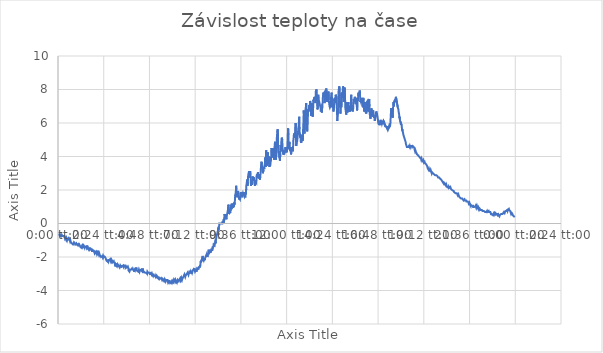
| Category | Závislost teploty na čase |
|---|---|
| 0.0006481481481481481 | -0.625 |
| 0.001365740740740741 | -0.625 |
| 0.0020717592592592593 | -0.625 |
| 0.002789351851851852 | -0.688 |
| 0.0034953703703703705 | -0.688 |
| 0.004212962962962963 | -0.688 |
| 0.004930555555555555 | -0.688 |
| 0.005636574074074074 | -0.75 |
| 0.006354166666666667 | -0.688 |
| 0.007071759259259259 | -0.75 |
| 0.007777777777777777 | -0.75 |
| 0.00849537037037037 | -0.688 |
| 0.00920138888888889 | -0.688 |
| 0.009918981481481482 | -0.75 |
| 0.010636574074074074 | -0.75 |
| 0.011342592592592592 | -0.75 |
| 0.012060185185185186 | -0.75 |
| 0.012777777777777777 | -0.75 |
| 0.013483796296296298 | -0.75 |
| 0.014201388888888888 | -0.812 |
| 0.014907407407407406 | -0.875 |
| 0.015625 | -0.812 |
| 0.016342592592592593 | -0.812 |
| 0.01704861111111111 | -0.875 |
| 0.017766203703703704 | -0.938 |
| 0.018483796296296297 | -0.875 |
| 0.019189814814814816 | -0.875 |
| 0.01990740740740741 | -1 |
| 0.020613425925925927 | -0.938 |
| 0.021331018518518517 | -0.938 |
| 0.022048611111111113 | -0.938 |
| 0.022754629629629628 | -0.875 |
| 0.023472222222222217 | -1 |
| 0.02417824074074074 | -0.938 |
| 0.024895833333333336 | -0.938 |
| 0.025613425925925925 | -1 |
| 0.02631944444444444 | -1.062 |
| 0.027037037037037037 | -1 |
| 0.02774305555555556 | -1.062 |
| 0.02804398148148148 | -1.125 |
| 0.02847222222222222 | -1.125 |
| 0.02918981481481481 | -1.125 |
| 0.02990740740740741 | -1.125 |
| 0.03061342592592593 | -1.188 |
| 0.031331018518518515 | -1.188 |
| 0.03203703703703704 | -1.188 |
| 0.03275462962962963 | -1.25 |
| 0.03347222222222222 | -1.25 |
| 0.03417824074074074 | -1.188 |
| 0.034895833333333334 | -1.125 |
| 0.03561342592592592 | -1.125 |
| 0.03631944444444444 | -1.125 |
| 0.03703703703703704 | -1.188 |
| 0.03774305555555556 | -1.25 |
| 0.03846064814814815 | -1.25 |
| 0.03917824074074074 | -1.25 |
| 0.03988425925925926 | -1.188 |
| 0.040601851851851854 | -1.25 |
| 0.04131944444444444 | -1.25 |
| 0.042025462962962966 | -1.25 |
| 0.042743055555555555 | -1.25 |
| 0.04344907407407408 | -1.312 |
| 0.04416666666666667 | -1.25 |
| 0.04488425925925926 | -1.188 |
| 0.04559027777777778 | -1.312 |
| 0.046307870370370374 | -1.25 |
| 0.04702546296296297 | -1.25 |
| 0.047731481481481486 | -1.312 |
| 0.04844907407407408 | -1.375 |
| 0.0491550925925926 | -1.375 |
| 0.04987268518518518 | -1.375 |
| 0.050590277777777776 | -1.438 |
| 0.05129629629629629 | -1.375 |
| 0.05201388888888889 | -1.375 |
| 0.05273148148148148 | -1.312 |
| 0.0534375 | -1.375 |
| 0.054155092592592595 | -1.312 |
| 0.054872685185185184 | -1.312 |
| 0.05557870370370371 | -1.375 |
| 0.056296296296296296 | -1.312 |
| 0.05700231481481482 | -1.312 |
| 0.05771990740740741 | -1.375 |
| 0.058437499999999996 | -1.438 |
| 0.05914351851851852 | -1.375 |
| 0.05986111111111111 | -1.375 |
| 0.0605787037037037 | -1.375 |
| 0.06128472222222222 | -1.375 |
| 0.06200231481481481 | -1.375 |
| 0.06270833333333332 | -1.438 |
| 0.06342592592592593 | -1.375 |
| 0.06414351851851852 | -1.312 |
| 0.06484953703703704 | -1.5 |
| 0.06556712962962963 | -1.5 |
| 0.06628472222222222 | -1.5 |
| 0.06699074074074074 | -1.562 |
| 0.06770833333333333 | -1.5 |
| 0.06842592592592593 | -1.438 |
| 0.06913194444444444 | -1.562 |
| 0.06984953703703704 | -1.562 |
| 0.07055555555555555 | -1.562 |
| 0.07127314814814815 | -1.5 |
| 0.07199074074074074 | -1.5 |
| 0.07269675925925927 | -1.562 |
| 0.07341435185185186 | -1.5 |
| 0.07413194444444444 | -1.625 |
| 0.07457175925925925 | -1.688 |
| 0.07486111111111111 | -1.688 |
| 0.07556712962962964 | -1.562 |
| 0.07628472222222223 | -1.625 |
| 0.07699074074074073 | -1.625 |
| 0.07770833333333334 | -1.625 |
| 0.07842592592592591 | -1.625 |
| 0.07913194444444445 | -1.688 |
| 0.07984953703703704 | -1.75 |
| 0.08056712962962963 | -1.688 |
| 0.08127314814814814 | -1.688 |
| 0.08199074074074074 | -1.75 |
| 0.08270833333333333 | -1.75 |
| 0.08341435185185185 | -1.688 |
| 0.08413194444444444 | -1.75 |
| 0.08484953703703703 | -1.812 |
| 0.08555555555555555 | -1.75 |
| 0.08627314814814814 | -1.75 |
| 0.08697916666666666 | -1.812 |
| 0.08769675925925925 | -1.625 |
| 0.08841435185185186 | -1.75 |
| 0.08912037037037036 | -1.812 |
| 0.08983796296296297 | -1.875 |
| 0.09055555555555556 | -1.812 |
| 0.09126157407407408 | -1.875 |
| 0.09197916666666667 | -1.875 |
| 0.09269675925925926 | -1.938 |
| 0.09340277777777778 | -1.938 |
| 0.09412037037037037 | -2 |
| 0.09483796296296297 | -2 |
| 0.09554398148148148 | -2 |
| 0.09626157407407408 | -2 |
| 0.09696759259259259 | -1.938 |
| 0.0976851851851852 | -2 |
| 0.09840277777777778 | -1.938 |
| 0.0991087962962963 | -2 |
| 0.0998263888888889 | -1.938 |
| 0.10053240740740742 | -1.938 |
| 0.10125 | -1.938 |
| 0.10196759259259258 | -1.938 |
| 0.10267361111111112 | -2 |
| 0.1033912037037037 | -2 |
| 0.10410879629629628 | -2.062 |
| 0.1048148148148148 | -2.125 |
| 0.1055324074074074 | -2.125 |
| 0.10625 | -2.125 |
| 0.10682870370370372 | -2.25 |
| 0.10697916666666667 | -2.188 |
| 0.10768518518518518 | -2.25 |
| 0.10840277777777778 | -2.25 |
| 0.10910879629629629 | -2.25 |
| 0.10982638888888889 | -2.312 |
| 0.11054398148148148 | -2.125 |
| 0.11125 | -2.25 |
| 0.11196759259259259 | -2.188 |
| 0.11268518518518518 | -2.188 |
| 0.1133912037037037 | -2.188 |
| 0.11410879629629629 | -2.125 |
| 0.1148263888888889 | -2.188 |
| 0.1155324074074074 | -2.25 |
| 0.11625 | -2.188 |
| 0.11695601851851851 | -2.25 |
| 0.11767361111111112 | -2.188 |
| 0.1183912037037037 | -2.188 |
| 0.11909722222222223 | -2.25 |
| 0.11981481481481482 | -2.312 |
| 0.12053240740740741 | -2.312 |
| 0.12123842592592593 | -2.312 |
| 0.12195601851851852 | -2.25 |
| 0.12267361111111112 | -2.312 |
| 0.12337962962962963 | -2.312 |
| 0.12409722222222223 | -2.375 |
| 0.12481481481481482 | -2.5 |
| 0.12552083333333333 | -2.562 |
| 0.12623842592592593 | -2.438 |
| 0.1269560185185185 | -2.438 |
| 0.12766203703703705 | -2.5 |
| 0.12837962962962962 | -2.375 |
| 0.12909722222222222 | -2.438 |
| 0.12980324074074073 | -2.5 |
| 0.13052083333333334 | -2.438 |
| 0.1312384259259259 | -2.438 |
| 0.13194444444444445 | -2.5 |
| 0.13266203703703702 | -2.5 |
| 0.13337962962962963 | -2.562 |
| 0.13408564814814813 | -2.562 |
| 0.13480324074074074 | -2.625 |
| 0.13550925925925925 | -2.562 |
| 0.13622685185185185 | -2.5 |
| 0.13694444444444445 | -2.5 |
| 0.13765046296296296 | -2.562 |
| 0.13836805555555556 | -2.625 |
| 0.13908564814814814 | -2.5 |
| 0.13979166666666668 | -2.562 |
| 0.14050925925925925 | -2.562 |
| 0.14122685185185185 | -2.562 |
| 0.14193287037037036 | -2.562 |
| 0.14265046296296297 | -2.5 |
| 0.14336805555555557 | -2.562 |
| 0.14407407407407408 | -2.5 |
| 0.14479166666666668 | -2.5 |
| 0.14550925925925925 | -2.5 |
| 0.1462152777777778 | -2.5 |
| 0.14693287037037037 | -2.5 |
| 0.14765046296296297 | -2.625 |
| 0.14835648148148148 | -2.625 |
| 0.14907407407407405 | -2.562 |
| 0.1497800925925926 | -2.562 |
| 0.1504976851851852 | -2.625 |
| 0.15121527777777777 | -2.625 |
| 0.15192129629629628 | -2.625 |
| 0.15263888888888888 | -2.562 |
| 0.15335648148148148 | -2.625 |
| 0.1540625 | -2.688 |
| 0.15439814814814815 | -2.812 |
| 0.15479166666666666 | -2.812 |
| 0.15550925925925926 | -2.812 |
| 0.15622685185185184 | -2.875 |
| 0.15693287037037038 | -2.812 |
| 0.15765046296296295 | -2.75 |
| 0.1583564814814815 | -2.75 |
| 0.15907407407407406 | -2.75 |
| 0.15979166666666667 | -2.75 |
| 0.16050925925925927 | -2.75 |
| 0.16121527777777778 | -2.75 |
| 0.16193287037037038 | -2.688 |
| 0.1626388888888889 | -2.75 |
| 0.1633564814814815 | -2.75 |
| 0.16407407407407407 | -2.75 |
| 0.1647800925925926 | -2.75 |
| 0.16549768518518518 | -2.75 |
| 0.16621527777777778 | -2.875 |
| 0.1669212962962963 | -2.75 |
| 0.1676388888888889 | -2.75 |
| 0.1683564814814815 | -2.812 |
| 0.1690625 | -2.75 |
| 0.1697800925925926 | -2.75 |
| 0.17049768518518518 | -2.688 |
| 0.17120370370370372 | -2.625 |
| 0.1719212962962963 | -2.75 |
| 0.17262731481481483 | -2.812 |
| 0.1733449074074074 | -2.812 |
| 0.1740625 | -2.812 |
| 0.17476851851851852 | -2.812 |
| 0.17548611111111112 | -2.875 |
| 0.17620370370370372 | -2.875 |
| 0.17690972222222223 | -2.75 |
| 0.17762731481481484 | -2.812 |
| 0.1783449074074074 | -2.875 |
| 0.17905092592592595 | -2.812 |
| 0.17976851851851852 | -2.812 |
| 0.18048611111111112 | -2.812 |
| 0.18119212962962963 | -2.812 |
| 0.18190972222222224 | -2.75 |
| 0.18262731481481484 | -2.812 |
| 0.18333333333333335 | -2.812 |
| 0.18405092592592595 | -2.812 |
| 0.18476851851851853 | -2.875 |
| 0.18547453703703706 | -2.688 |
| 0.18619212962962964 | -2.812 |
| 0.1869097222222222 | -2.938 |
| 0.18761574074074075 | -2.875 |
| 0.18833333333333332 | -2.875 |
| 0.18905092592592596 | -2.875 |
| 0.18975694444444446 | -2.875 |
| 0.190474537037037 | -2.938 |
| 0.19118055555555555 | -2.938 |
| 0.19189814814814818 | -2.938 |
| 0.19261574074074073 | -2.938 |
| 0.19332175925925923 | -2.938 |
| 0.19403935185185184 | -2.938 |
| 0.19475694444444444 | -3 |
| 0.19546296296296295 | -2.875 |
| 0.19618055555555555 | -2.875 |
| 0.19689814814814813 | -2.938 |
| 0.19760416666666666 | -2.938 |
| 0.19832175925925924 | -2.938 |
| 0.19903935185185184 | -2.938 |
| 0.19974537037037035 | -2.938 |
| 0.20046296296296295 | -2.938 |
| 0.20118055555555556 | -3.062 |
| 0.20188657407407407 | -2.938 |
| 0.20260416666666667 | -3.062 |
| 0.20332175925925924 | -3 |
| 0.20402777777777778 | -3 |
| 0.20474537037037036 | -3.062 |
| 0.20546296296296296 | -3 |
| 0.20616898148148147 | -3.062 |
| 0.20688657407407407 | -3.062 |
| 0.20759259259259258 | -3.125 |
| 0.20831018518518518 | -3 |
| 0.20902777777777778 | -3.125 |
| 0.2097337962962963 | -3.125 |
| 0.2104513888888889 | -3.125 |
| 0.21116898148148147 | -3.125 |
| 0.211875 | -3.125 |
| 0.21259259259259258 | -3.125 |
| 0.21331018518518519 | -3.188 |
| 0.2140162037037037 | -3.125 |
| 0.2147337962962963 | -3.188 |
| 0.2154513888888889 | -3.188 |
| 0.2161574074074074 | -3.125 |
| 0.216875 | -3.125 |
| 0.2175925925925926 | -3.188 |
| 0.21829861111111112 | -3.25 |
| 0.2190162037037037 | -3.25 |
| 0.2197337962962963 | -3.25 |
| 0.2204398148148148 | -3.312 |
| 0.2211574074074074 | -3.25 |
| 0.22187500000000002 | -3.25 |
| 0.22258101851851853 | -3.312 |
| 0.22329861111111113 | -3.312 |
| 0.22400462962962964 | -3.312 |
| 0.22472222222222224 | -3.312 |
| 0.22543981481481482 | -3.25 |
| 0.22614583333333335 | -3.25 |
| 0.22686342592592593 | -3.312 |
| 0.22758101851851853 | -3.312 |
| 0.2277662037037037 | -3.375 |
| 0.2283101851851852 | -3.375 |
| 0.2290162037037037 | -3.312 |
| 0.2297337962962963 | -3.312 |
| 0.23043981481481482 | -3.375 |
| 0.23115740740740742 | -3.375 |
| 0.23187499999999997 | -3.438 |
| 0.2325810185185185 | -3.375 |
| 0.23329861111111114 | -3.312 |
| 0.23401620370370368 | -3.312 |
| 0.2347222222222222 | -3.375 |
| 0.23543981481481482 | -3.438 |
| 0.2361574074074074 | -3.375 |
| 0.2368634259259259 | -3.375 |
| 0.23758101851851854 | -3.375 |
| 0.23829861111111109 | -3.375 |
| 0.23900462962962962 | -3.375 |
| 0.23972222222222225 | -3.438 |
| 0.2404398148148148 | -3.5 |
| 0.2411458333333333 | -3.438 |
| 0.2418634259259259 | -3.438 |
| 0.24258101851851852 | -3.5 |
| 0.24328703703703702 | -3.375 |
| 0.24400462962962963 | -3.5 |
| 0.2447222222222222 | -3.5 |
| 0.24542824074074074 | -3.5 |
| 0.2461458333333333 | -3.5 |
| 0.24686342592592592 | -3.562 |
| 0.24756944444444443 | -3.562 |
| 0.24828703703703703 | -3.562 |
| 0.24899305555555554 | -3.438 |
| 0.24971064814814814 | -3.5 |
| 0.2504282407407407 | -3.438 |
| 0.25113425925925925 | -3.438 |
| 0.2518518518518518 | -3.5 |
| 0.25256944444444446 | -3.438 |
| 0.25327546296296294 | -3.375 |
| 0.25399305555555557 | -3.438 |
| 0.25471064814814814 | -3.375 |
| 0.2554166666666667 | -3.375 |
| 0.25613425925925926 | -3.438 |
| 0.25685185185185183 | -3.375 |
| 0.25755787037037037 | -3.438 |
| 0.25827546296296294 | -3.5 |
| 0.2589930555555556 | -3.5 |
| 0.25969907407407405 | -3.438 |
| 0.2604166666666667 | -3.5 |
| 0.26112268518518517 | -3.438 |
| 0.2618402777777778 | -3.375 |
| 0.26255787037037037 | -3.375 |
| 0.2632638888888889 | -3.438 |
| 0.2639814814814815 | -3.438 |
| 0.26469907407407406 | -3.438 |
| 0.2654050925925926 | -3.438 |
| 0.26612268518518517 | -3.312 |
| 0.2668402777777778 | -3.375 |
| 0.2675462962962963 | -3.312 |
| 0.2682638888888889 | -3.375 |
| 0.2689814814814815 | -3.375 |
| 0.2696875 | -3.25 |
| 0.2704050925925926 | -3.312 |
| 0.2711226851851852 | -3.375 |
| 0.2718287037037037 | -3.312 |
| 0.2725462962962963 | -3.312 |
| 0.2732638888888889 | -3.312 |
| 0.2739699074074074 | -3.188 |
| 0.27468750000000003 | -3.188 |
| 0.2754050925925926 | -3.188 |
| 0.27611111111111114 | -3.062 |
| 0.2768287037037037 | -3.188 |
| 0.27753472222222225 | -3.125 |
| 0.2782523148148148 | -3.188 |
| 0.2789699074074074 | -3.125 |
| 0.27967592592592594 | -3.125 |
| 0.2803935185185185 | -3.062 |
| 0.2811111111111111 | -3.062 |
| 0.2818171296296296 | -3 |
| 0.28253472222222226 | -3 |
| 0.2832523148148148 | -2.938 |
| 0.2839583333333333 | -3.062 |
| 0.28467592592592594 | -3 |
| 0.2853935185185185 | -3.062 |
| 0.286099537037037 | -3 |
| 0.28681712962962963 | -3 |
| 0.2875347222222222 | -2.938 |
| 0.28824074074074074 | -2.938 |
| 0.2889583333333334 | -2.875 |
| 0.28935185185185186 | -2.812 |
| 0.2896875 | -2.938 |
| 0.2903935185185185 | -2.875 |
| 0.2911111111111111 | -2.875 |
| 0.2918287037037037 | -3 |
| 0.2925347222222222 | -2.875 |
| 0.2932523148148148 | -2.938 |
| 0.2939699074074074 | -2.875 |
| 0.2946759259259259 | -2.812 |
| 0.2953935185185185 | -2.812 |
| 0.2961111111111111 | -2.75 |
| 0.29681712962962964 | -2.812 |
| 0.2975347222222222 | -2.688 |
| 0.2982523148148148 | -2.75 |
| 0.2989583333333333 | -2.812 |
| 0.2996759259259259 | -2.875 |
| 0.30039351851851853 | -2.875 |
| 0.301099537037037 | -2.875 |
| 0.30181712962962964 | -2.75 |
| 0.3025347222222222 | -2.875 |
| 0.30324074074074076 | -2.812 |
| 0.30395833333333333 | -2.812 |
| 0.3046759259259259 | -2.75 |
| 0.30538194444444444 | -2.75 |
| 0.306099537037037 | -2.688 |
| 0.30680555555555555 | -2.75 |
| 0.30752314814814813 | -2.625 |
| 0.30824074074074076 | -2.625 |
| 0.30894675925925924 | -2.625 |
| 0.30966435185185187 | -2.562 |
| 0.31038194444444445 | -2.625 |
| 0.311087962962963 | -2.5 |
| 0.31180555555555556 | -2.375 |
| 0.3120601851851852 | -2.25 |
| 0.3125347222222222 | -2.312 |
| 0.3132523148148148 | -2.312 |
| 0.31395833333333334 | -2.188 |
| 0.3146759259259259 | -2.125 |
| 0.31538194444444445 | -2.125 |
| 0.316099537037037 | -1.938 |
| 0.31681712962962966 | -2 |
| 0.31752314814814814 | -2.25 |
| 0.31824074074074077 | -2.125 |
| 0.31895833333333334 | -2.188 |
| 0.3196643518518519 | -2.188 |
| 0.32038194444444446 | -2.062 |
| 0.32109953703703703 | -2.188 |
| 0.32180555555555557 | -2.062 |
| 0.32252314814814814 | -2 |
| 0.3232291666666667 | -2 |
| 0.32394675925925925 | -2 |
| 0.3246643518518519 | -2 |
| 0.32537037037037037 | -1.812 |
| 0.326087962962963 | -1.938 |
| 0.32680555555555557 | -2 |
| 0.3275115740740741 | -1.875 |
| 0.3282291666666666 | -1.812 |
| 0.32894675925925926 | -1.75 |
| 0.32896990740740745 | -1.688 |
| 0.32966435185185183 | -1.562 |
| 0.33038194444444446 | -1.688 |
| 0.33109953703703704 | -1.75 |
| 0.3318055555555555 | -1.75 |
| 0.33252314814814815 | -1.688 |
| 0.3332407407407407 | -1.75 |
| 0.33394675925925926 | -1.625 |
| 0.3346643518518519 | -1.688 |
| 0.3353819444444444 | -1.562 |
| 0.33608796296296295 | -1.5 |
| 0.3368055555555556 | -1.625 |
| 0.3375115740740741 | -1.562 |
| 0.33822916666666664 | -1.375 |
| 0.33894675925925927 | -1.438 |
| 0.3396527777777778 | -1.375 |
| 0.3403703703703704 | -1.25 |
| 0.341087962962963 | -1.25 |
| 0.3417939814814815 | -1.25 |
| 0.34251157407407407 | -1.312 |
| 0.3432175925925926 | -1.312 |
| 0.34368055555555554 | -1.125 |
| 0.34394675925925927 | -1.125 |
| 0.3446643518518519 | -1.188 |
| 0.3453819444444444 | -0.938 |
| 0.34608796296296296 | -0.875 |
| 0.3468055555555556 | -0.75 |
| 0.3475115740740741 | -0.75 |
| 0.34822916666666665 | -0.75 |
| 0.3486458333333333 | -0.562 |
| 0.3489583333333333 | -0.5 |
| 0.34967592592592595 | -0.438 |
| 0.3503819444444445 | -0.25 |
| 0.35109953703703706 | -0.375 |
| 0.3518171296296296 | -0.188 |
| 0.3525231481481481 | -0.125 |
| 0.3527314814814815 | 0 |
| 0.3532523148148148 | 0 |
| 0.3539583333333333 | 0 |
| 0.35467592592592595 | 0 |
| 0.35539351851851847 | 0 |
| 0.35940972222222217 | 0 |
| 0.3601157407407407 | 0.125 |
| 0.36083333333333334 | 0 |
| 0.3615509259259259 | 0.125 |
| 0.3622569444444444 | 0.25 |
| 0.362974537037037 | 0.062 |
| 0.36368055555555556 | 0.312 |
| 0.36417824074074073 | 0.562 |
| 0.36440972222222223 | 0.5 |
| 0.3651273148148148 | 0.438 |
| 0.3658333333333333 | 0.438 |
| 0.3665509259259259 | 0.562 |
| 0.3672685185185185 | 0.438 |
| 0.36797453703703703 | 0.25 |
| 0.36869212962962966 | 0.375 |
| 0.3694097222222222 | 0.5 |
| 0.3701157407407407 | 0.5 |
| 0.37083333333333335 | 0.688 |
| 0.3715509259259259 | 0.812 |
| 0.3722569444444444 | 1.062 |
| 0.37232638888888886 | 1.125 |
| 0.3729861111111111 | 1.062 |
| 0.3737037037037037 | 0.75 |
| 0.37395833333333334 | 0.562 |
| 0.3744212962962963 | 0.562 |
| 0.3751388888888889 | 0.625 |
| 0.3758564814814815 | 0.688 |
| 0.37656249999999997 | 0.625 |
| 0.3772800925925926 | 0.875 |
| 0.37777777777777777 | 1.125 |
| 0.37800925925925927 | 1.125 |
| 0.3787152777777778 | 0.875 |
| 0.3794328703703704 | 1 |
| 0.38013888888888886 | 1.188 |
| 0.3808564814814815 | 0.938 |
| 0.38157407407407407 | 0.938 |
| 0.3822800925925926 | 1 |
| 0.38299768518518523 | 0.938 |
| 0.3837037037037037 | 1.188 |
| 0.3844212962962963 | 1 |
| 0.3851388888888889 | 1.25 |
| 0.38584490740740746 | 1.125 |
| 0.3865625 | 1.25 |
| 0.3872685185185185 | 1.562 |
| 0.387962962962963 | 1.688 |
| 0.3879976851851852 | 1.625 |
| 0.3887152777777778 | 1.812 |
| 0.38942129629629635 | 2.188 |
| 0.3895486111111111 | 2.25 |
| 0.390150462962963 | 2.062 |
| 0.39086805555555554 | 1.75 |
| 0.3910648148148148 | 1.688 |
| 0.3915972222222222 | 1.625 |
| 0.39230324074074074 | 1.562 |
| 0.3930208333333333 | 1.75 |
| 0.3937268518518518 | 1.938 |
| 0.39444444444444443 | 1.875 |
| 0.395162037037037 | 1.812 |
| 0.39586805555555554 | 1.438 |
| 0.3965856481481482 | 1.5 |
| 0.3973032407407407 | 1.5 |
| 0.39800925925925923 | 1.438 |
| 0.39872685185185186 | 1.438 |
| 0.3994328703703704 | 1.688 |
| 0.4001504629629629 | 1.875 |
| 0.40086805555555555 | 1.812 |
| 0.4015740740740741 | 1.75 |
| 0.40229166666666666 | 1.75 |
| 0.40299768518518514 | 1.562 |
| 0.40371527777777777 | 1.75 |
| 0.40443287037037035 | 1.812 |
| 0.4051388888888889 | 1.75 |
| 0.4058564814814815 | 1.688 |
| 0.4065625 | 1.875 |
| 0.40728009259259257 | 1.688 |
| 0.4079976851851852 | 1.625 |
| 0.40870370370370374 | 1.688 |
| 0.40942129629629626 | 1.562 |
| 0.4101273148148148 | 1.812 |
| 0.4108449074074074 | 1.75 |
| 0.4115625 | 2.062 |
| 0.4117361111111111 | 2.25 |
| 0.41228009259259263 | 2.312 |
| 0.41299768518518515 | 2.312 |
| 0.4137152777777778 | 2.625 |
| 0.4144212962962963 | 2.25 |
| 0.4151388888888889 | 2.5 |
| 0.4157523148148148 | 2.812 |
| 0.41586805555555556 | 2.875 |
| 0.41657407407407404 | 2.875 |
| 0.41729166666666667 | 3.062 |
| 0.4179976851851852 | 3.125 |
| 0.4187152777777778 | 2.75 |
| 0.4194328703703704 | 3 |
| 0.4201388888888889 | 3.125 |
| 0.42085648148148147 | 2.938 |
| 0.4215625 | 2.625 |
| 0.42194444444444446 | 2.25 |
| 0.4222916666666667 | 2.375 |
| 0.4230092592592593 | 2.562 |
| 0.4237152777777778 | 2.562 |
| 0.42443287037037036 | 2.312 |
| 0.425150462962963 | 2.562 |
| 0.42560185185185184 | 2.812 |
| 0.42586805555555557 | 2.562 |
| 0.4265856481481482 | 2.625 |
| 0.4273032407407407 | 2.562 |
| 0.42800925925925926 | 2.75 |
| 0.4287268518518519 | 2.75 |
| 0.4294328703703704 | 2.562 |
| 0.43015046296296294 | 2.562 |
| 0.43059027777777775 | 2.25 |
| 0.4308796296296296 | 2.25 |
| 0.4315972222222222 | 2.562 |
| 0.4323032407407407 | 2.5 |
| 0.43302083333333335 | 2.5 |
| 0.43372685185185184 | 2.438 |
| 0.43424768518518514 | 2.812 |
| 0.4344560185185185 | 2.875 |
| 0.4351736111111111 | 2.938 |
| 0.4358796296296296 | 2.75 |
| 0.43659722222222225 | 2.75 |
| 0.43730324074074073 | 3.062 |
| 0.4380208333333333 | 2.812 |
| 0.43873842592592593 | 2.688 |
| 0.43944444444444447 | 2.75 |
| 0.440162037037037 | 2.812 |
| 0.4408680555555555 | 2.938 |
| 0.44158564814814816 | 2.625 |
| 0.44230324074074073 | 2.812 |
| 0.4430092592592592 | 3 |
| 0.44372685185185184 | 3.312 |
| 0.4438194444444445 | 3.375 |
| 0.4444444444444444 | 3.375 |
| 0.44516203703703705 | 3.688 |
| 0.4458796296296296 | 3.438 |
| 0.4465856481481481 | 3.438 |
| 0.44730324074074074 | 3.125 |
| 0.4480092592592593 | 3 |
| 0.44872685185185185 | 3 |
| 0.4494444444444445 | 3.188 |
| 0.45015046296296296 | 3.375 |
| 0.45086805555555554 | 3.25 |
| 0.45157407407407407 | 3.438 |
| 0.4522916666666667 | 3.5 |
| 0.45296296296296296 | 3.938 |
| 0.4530208333333334 | 3.938 |
| 0.45372685185185185 | 3.688 |
| 0.4539930555555556 | 3.375 |
| 0.4544560185185185 | 3.438 |
| 0.4548611111111111 | 3.938 |
| 0.4551851851851852 | 4.375 |
| 0.45590277777777777 | 3.562 |
| 0.4566087962962963 | 3.438 |
| 0.45732638888888894 | 3.625 |
| 0.4580324074074074 | 3.938 |
| 0.45875 | 4.25 |
| 0.4594560185185185 | 4.062 |
| 0.46017361111111116 | 3.875 |
| 0.4608912037037037 | 4 |
| 0.4615972222222222 | 3.562 |
| 0.46231481481481485 | 3.438 |
| 0.46239583333333334 | 3.375 |
| 0.4630439814814815 | 3.688 |
| 0.46375000000000005 | 3.438 |
| 0.46446759259259257 | 3.562 |
| 0.4651736111111111 | 3.562 |
| 0.46589120370370374 | 3.812 |
| 0.46601851851851855 | 3.938 |
| 0.46662037037037035 | 4.375 |
| 0.46677083333333336 | 4.5 |
| 0.467349537037037 | 4.438 |
| 0.4680555555555555 | 4.062 |
| 0.46828703703703706 | 3.938 |
| 0.46878472222222217 | 3.938 |
| 0.4695023148148148 | 4.438 |
| 0.469525462962963 | 4.5 |
| 0.4702199074074074 | 4.25 |
| 0.4709375 | 4.188 |
| 0.47164351851851855 | 4.188 |
| 0.47203703703703703 | 3.938 |
| 0.4723726851851852 | 3.812 |
| 0.47309027777777773 | 4.25 |
| 0.4733449074074074 | 4.5 |
| 0.4738194444444444 | 4.625 |
| 0.47452546296296294 | 4.875 |
| 0.47524305555555557 | 4.188 |
| 0.4759027777777778 | 3.938 |
| 0.47597222222222224 | 3.938 |
| 0.4766782407407408 | 3.812 |
| 0.4773958333333333 | 4.188 |
| 0.4777777777777778 | 4.5 |
| 0.47812499999999997 | 4.812 |
| 0.47833333333333333 | 5.062 |
| 0.47885416666666664 | 5.188 |
| 0.4795601851851852 | 5.5 |
| 0.4802777777777778 | 5.5 |
| 0.4804861111111111 | 5.625 |
| 0.4810069444444445 | 5.312 |
| 0.48114583333333333 | 5.062 |
| 0.48136574074074073 | 4.5 |
| 0.4817476851851852 | 4.312 |
| 0.4824537037037037 | 4.188 |
| 0.48317129629629635 | 4.312 |
| 0.4838541666666667 | 3.938 |
| 0.483900462962963 | 3.938 |
| 0.4846064814814815 | 3.875 |
| 0.4853240740740741 | 3.75 |
| 0.4860300925925926 | 4.125 |
| 0.48662037037037037 | 4.5 |
| 0.4867592592592593 | 4.688 |
| 0.4874768518518518 | 4.312 |
| 0.48818287037037034 | 4.688 |
| 0.48875 | 5.062 |
| 0.488912037037037 | 5.062 |
| 0.48962962962962964 | 5.125 |
| 0.4903356481481482 | 5 |
| 0.4910532407407407 | 4.562 |
| 0.49112268518518515 | 4.5 |
| 0.49178240740740736 | 4.375 |
| 0.4924884259259259 | 4.125 |
| 0.49320601851851853 | 4.25 |
| 0.49391203703703707 | 4.125 |
| 0.4946296296296296 | 4.375 |
| 0.4953356481481481 | 4.375 |
| 0.49605324074074075 | 4.25 |
| 0.49677083333333333 | 4.312 |
| 0.4974768518518518 | 4.562 |
| 0.49819444444444444 | 4.25 |
| 0.498900462962963 | 4.562 |
| 0.49961805555555555 | 4.375 |
| 0.5003240740740741 | 4.25 |
| 0.5010416666666667 | 4.5 |
| 0.5017592592592592 | 4.625 |
| 0.5023958333333333 | 5.062 |
| 0.5024768518518519 | 5.125 |
| 0.502962962962963 | 5.625 |
| 0.5032060185185185 | 5.688 |
| 0.5039236111111111 | 5.312 |
| 0.5040972222222222 | 5.062 |
| 0.504537037037037 | 4.5 |
| 0.5046643518518519 | 4.438 |
| 0.5053703703703704 | 4.812 |
| 0.506087962962963 | 4.875 |
| 0.5068055555555556 | 4.75 |
| 0.5075115740740741 | 4.312 |
| 0.5082291666666666 | 4.375 |
| 0.5089351851851852 | 4.312 |
| 0.5096527777777778 | 4.125 |
| 0.5103587962962963 | 4.312 |
| 0.5110763888888888 | 4.438 |
| 0.5117939814814815 | 4.375 |
| 0.5125000000000001 | 4.562 |
| 0.5132175925925926 | 4.312 |
| 0.5139236111111111 | 4.438 |
| 0.5146412037037037 | 4.938 |
| 0.5149652777777778 | 5.062 |
| 0.5153703703703704 | 5.125 |
| 0.516076388888889 | 5.375 |
| 0.5167939814814815 | 5.188 |
| 0.5175 | 5.125 |
| 0.5182175925925926 | 5.25 |
| 0.5188310185185185 | 5.625 |
| 0.5189467592592593 | 5.688 |
| 0.5196527777777779 | 6 |
| 0.5203703703703704 | 5.188 |
| 0.520474537037037 | 5.062 |
| 0.521099537037037 | 4.625 |
| 0.5218055555555555 | 5 |
| 0.5225231481481482 | 4.875 |
| 0.5232291666666666 | 4.938 |
| 0.5239467592592593 | 5.188 |
| 0.5246643518518518 | 5.312 |
| 0.5253356481481481 | 5.625 |
| 0.5253819444444444 | 5.688 |
| 0.526099537037037 | 5.75 |
| 0.5268171296296297 | 6.062 |
| 0.5269097222222222 | 6.188 |
| 0.5275347222222222 | 6.375 |
| 0.5279398148148148 | 5.625 |
| 0.5282638888888889 | 5.5 |
| 0.5289814814814815 | 5.375 |
| 0.5296875 | 5.125 |
| 0.5304050925925926 | 5.312 |
| 0.530798611111111 | 5.062 |
| 0.5311342592592593 | 4.875 |
| 0.5318402777777778 | 4.812 |
| 0.5325578703703704 | 4.812 |
| 0.5332754629629629 | 5.062 |
| 0.5339814814814815 | 5.25 |
| 0.5346990740740741 | 5.062 |
| 0.5354050925925926 | 4.938 |
| 0.5360532407407407 | 5.625 |
| 0.5361342592592593 | 5.625 |
| 0.5368518518518518 | 6.125 |
| 0.536863425925926 | 6.188 |
| 0.5375 | 6.75 |
| 0.5375925925925926 | 6.625 |
| 0.5382407407407407 | 6.188 |
| 0.5383217592592593 | 6.062 |
| 0.5386805555555555 | 5.625 |
| 0.5390393518518518 | 5.375 |
| 0.5397569444444444 | 5.875 |
| 0.5404745370370371 | 6 |
| 0.5405902777777778 | 6.188 |
| 0.5410300925925926 | 6.75 |
| 0.5412037037037037 | 6.812 |
| 0.5419212962962963 | 6.875 |
| 0.5426388888888889 | 7.188 |
| 0.5433449074074074 | 6.688 |
| 0.5436689814814815 | 6.188 |
| 0.544074074074074 | 5.688 |
| 0.5441319444444445 | 5.625 |
| 0.5448032407407407 | 5.5 |
| 0.5455092592592593 | 5.625 |
| 0.5462268518518518 | 6.125 |
| 0.54625 | 6.188 |
| 0.5468287037037037 | 6.75 |
| 0.5469675925925926 | 6.812 |
| 0.5476736111111111 | 6.688 |
| 0.5483912037037036 | 6.75 |
| 0.5491087962962963 | 7.062 |
| 0.5498148148148149 | 6.75 |
| 0.5505324074074074 | 7.062 |
| 0.5512384259259259 | 7.188 |
| 0.5512962962962963 | 7.312 |
| 0.5519675925925925 | 7.25 |
| 0.5526851851851852 | 6.938 |
| 0.552951388888889 | 6.75 |
| 0.5534027777777778 | 6.438 |
| 0.5541203703703704 | 6.938 |
| 0.5548263888888889 | 7.125 |
| 0.5555439814814814 | 7.188 |
| 0.5562615740740741 | 6.688 |
| 0.5569675925925927 | 6.375 |
| 0.5576851851851852 | 6.625 |
| 0.5583101851851852 | 7.312 |
| 0.5584143518518518 | 7.375 |
| 0.5591203703703703 | 7.312 |
| 0.559837962962963 | 7.5 |
| 0.5605439814814815 | 7.438 |
| 0.5612615740740741 | 7.562 |
| 0.5619675925925925 | 7.5 |
| 0.5626851851851852 | 7.188 |
| 0.5633912037037038 | 7.312 |
| 0.5638773148148148 | 7.875 |
| 0.5641203703703704 | 7.812 |
| 0.564837962962963 | 8 |
| 0.5655439814814814 | 7.938 |
| 0.5662615740740741 | 7.625 |
| 0.5666550925925926 | 7.312 |
| 0.5669907407407407 | 7.125 |
| 0.5676967592592593 | 6.812 |
| 0.5684143518518519 | 7.5 |
| 0.5691203703703703 | 7.688 |
| 0.569837962962963 | 7.438 |
| 0.5705439814814816 | 7.438 |
| 0.5743981481481482 | 6.875 |
| 0.5744097222222222 | 6.688 |
| 0.5751273148148148 | 6.75 |
| 0.5758333333333333 | 6.75 |
| 0.5765509259259259 | 6.688 |
| 0.5772569444444444 | 6.625 |
| 0.577974537037037 | 7.125 |
| 0.5786921296296296 | 7.188 |
| 0.57875 | 7.25 |
| 0.5794097222222222 | 7.625 |
| 0.5801273148148148 | 7.75 |
| 0.5801736111111111 | 7.812 |
| 0.5808564814814815 | 7.75 |
| 0.5815625 | 7.75 |
| 0.5822800925925926 | 7.812 |
| 0.5826967592592592 | 7.25 |
| 0.5830092592592593 | 7.188 |
| 0.5837152777777778 | 7.438 |
| 0.5844328703703704 | 7.625 |
| 0.5851388888888889 | 7.375 |
| 0.5857523148148148 | 7.812 |
| 0.5858680555555555 | 7.875 |
| 0.5865856481481482 | 8.062 |
| 0.5872916666666667 | 8.062 |
| 0.5880092592592593 | 7.625 |
| 0.5881828703703703 | 7.25 |
| 0.588738425925926 | 7.25 |
| 0.5894444444444444 | 7.688 |
| 0.5901620370370371 | 7.625 |
| 0.5908680555555555 | 7.625 |
| 0.5910185185185185 | 7.812 |
| 0.5915972222222222 | 7.875 |
| 0.5923148148148148 | 7.375 |
| 0.5924421296296296 | 7.25 |
| 0.5930324074074075 | 7.188 |
| 0.59375 | 7 |
| 0.5944675925925926 | 6.938 |
| 0.5951736111111111 | 7 |
| 0.5958912037037037 | 7.188 |
| 0.5965972222222222 | 6.938 |
| 0.5973148148148147 | 7.562 |
| 0.5980208333333333 | 7.75 |
| 0.598125 | 7.812 |
| 0.59875 | 7.75 |
| 0.5992824074074073 | 7.25 |
| 0.5994791666666667 | 7.188 |
| 0.6001967592592593 | 7.438 |
| 0.6009027777777778 | 7.312 |
| 0.6016203703703703 | 6.875 |
| 0.6023263888888889 | 6.875 |
| 0.6024421296296296 | 6.688 |
| 0.6030555555555556 | 6.688 |
| 0.6037731481481482 | 7.062 |
| 0.6044791666666667 | 7.125 |
| 0.6045949074074074 | 7.25 |
| 0.6052083333333333 | 7.5 |
| 0.6059259259259259 | 7.312 |
| 0.6066319444444445 | 7.188 |
| 0.6073495370370371 | 7.688 |
| 0.6080555555555556 | 7.625 |
| 0.6087731481481481 | 7.562 |
| 0.6094791666666667 | 7.562 |
| 0.6101504629629629 | 6.688 |
| 0.6102083333333334 | 6.625 |
| 0.6109143518518518 | 6.125 |
| 0.6109375 | 6.188 |
| 0.6116435185185185 | 6.438 |
| 0.6123611111111111 | 6.562 |
| 0.6124421296296296 | 6.688 |
| 0.6129050925925926 | 7.25 |
| 0.6131018518518518 | 7.562 |
| 0.6135763888888889 | 7.812 |
| 0.6138310185185185 | 8 |
| 0.614537037037037 | 8.062 |
| 0.6152546296296296 | 8.188 |
| 0.6159722222222223 | 7.625 |
| 0.616574074074074 | 7.25 |
| 0.6166898148148149 | 7.125 |
| 0.617337962962963 | 6.688 |
| 0.6174189814814816 | 6.562 |
| 0.6181365740740741 | 6.625 |
| 0.6188425925925926 | 7.125 |
| 0.6189351851851852 | 7.25 |
| 0.6195717592592592 | 6.938 |
| 0.6202893518518519 | 7.75 |
| 0.6204398148148148 | 7.812 |
| 0.6210069444444445 | 7.625 |
| 0.621724537037037 | 7.5 |
| 0.6224421296296296 | 7.812 |
| 0.6231481481481481 | 8.188 |
| 0.6238657407407407 | 8.125 |
| 0.6245717592592592 | 7.375 |
| 0.6246759259259259 | 7.25 |
| 0.6253009259259259 | 7.312 |
| 0.6257523148148149 | 7.812 |
| 0.6260300925925926 | 7.938 |
| 0.626736111111111 | 8.125 |
| 0.6274537037037037 | 7.75 |
| 0.6280439814814814 | 7.25 |
| 0.6281828703703703 | 6.938 |
| 0.6288888888888889 | 6.812 |
| 0.6295023148148148 | 6.688 |
| 0.6296180555555556 | 6.625 |
| 0.6303240740740741 | 6.5 |
| 0.6310416666666666 | 7.062 |
| 0.6317592592592592 | 7.188 |
| 0.6319212962962962 | 7.25 |
| 0.6324768518518519 | 6.812 |
| 0.6326388888888889 | 6.688 |
| 0.6332060185185185 | 6.625 |
| 0.6339236111111112 | 6.812 |
| 0.6346296296296297 | 7 |
| 0.6349421296296297 | 7.25 |
| 0.6353587962962963 | 7.125 |
| 0.6360763888888888 | 7.125 |
| 0.6367013888888889 | 6.688 |
| 0.6368055555555555 | 6.688 |
| 0.6375115740740741 | 7 |
| 0.6382291666666667 | 6.688 |
| 0.6389351851851852 | 6.875 |
| 0.6396527777777777 | 7 |
| 0.6403587962962963 | 6.938 |
| 0.6406597222222222 | 7.25 |
| 0.641087962962963 | 7.688 |
| 0.6418055555555555 | 6.812 |
| 0.642511574074074 | 6.75 |
| 0.6432291666666666 | 7.062 |
| 0.6439351851851852 | 7 |
| 0.6442708333333333 | 6.688 |
| 0.6446643518518519 | 6.688 |
| 0.6453819444444444 | 6.812 |
| 0.6459490740740741 | 7.25 |
| 0.646099537037037 | 7.375 |
| 0.6468171296296296 | 7.438 |
| 0.6475347222222222 | 7.25 |
| 0.6482407407407408 | 7.375 |
| 0.6489583333333333 | 7.562 |
| 0.6496643518518518 | 7.5 |
| 0.6503819444444444 | 7.188 |
| 0.651087962962963 | 7.125 |
| 0.6518055555555555 | 7.375 |
| 0.652511574074074 | 7.5 |
| 0.6532291666666666 | 7.188 |
| 0.6539467592592593 | 6.75 |
| 0.6546527777777778 | 6.875 |
| 0.6553703703703704 | 7.375 |
| 0.6560763888888889 | 7.312 |
| 0.6567939814814815 | 7.562 |
| 0.6569791666666667 | 7.812 |
| 0.6575231481481482 | 7.625 |
| 0.6582291666666666 | 7.75 |
| 0.6589467592592593 | 7.812 |
| 0.6596527777777778 | 7.938 |
| 0.6603703703703704 | 7.875 |
| 0.6610648148148148 | 7.25 |
| 0.661099537037037 | 7.25 |
| 0.6618055555555555 | 7.312 |
| 0.6625231481481482 | 7.25 |
| 0.6632291666666666 | 7.312 |
| 0.6639467592592593 | 7.5 |
| 0.6646527777777778 | 7.25 |
| 0.6653703703703704 | 7.312 |
| 0.6660763888888889 | 7 |
| 0.6667939814814815 | 6.938 |
| 0.6675115740740741 | 7.5 |
| 0.6682175925925926 | 7.375 |
| 0.6689351851851852 | 7.062 |
| 0.6695138888888889 | 6.688 |
| 0.6696527777777778 | 6.688 |
| 0.6703703703703704 | 7.062 |
| 0.6705671296296297 | 7.25 |
| 0.6710995370370371 | 6.875 |
| 0.6718055555555557 | 6.875 |
| 0.6721875 | 6.688 |
| 0.6725347222222222 | 6.688 |
| 0.6732523148148148 | 6.625 |
| 0.6739583333333333 | 6.562 |
| 0.674675925925926 | 6.688 |
| 0.6753935185185185 | 7.188 |
| 0.6754166666666667 | 7.25 |
| 0.6761111111111111 | 7.25 |
| 0.6768287037037037 | 7.312 |
| 0.6775347222222222 | 7.125 |
| 0.6781018518518519 | 6.688 |
| 0.6782638888888889 | 6.688 |
| 0.6789814814814815 | 6.688 |
| 0.6796875 | 6.812 |
| 0.6802199074074075 | 7.25 |
| 0.6804166666666666 | 7.438 |
| 0.6811342592592592 | 7 |
| 0.6813541666666666 | 6.688 |
| 0.681863425925926 | 6.5 |
| 0.6825694444444445 | 6.438 |
| 0.683287037037037 | 6.25 |
| 0.6839930555555555 | 6.562 |
| 0.6847106481481481 | 6.75 |
| 0.6854166666666667 | 6.875 |
| 0.6861342592592593 | 6.75 |
| 0.6868402777777778 | 6.5 |
| 0.6875578703703704 | 6.375 |
| 0.6882754629629629 | 6.438 |
| 0.6889814814814814 | 6.75 |
| 0.689699074074074 | 6.688 |
| 0.6904050925925925 | 6.5 |
| 0.6911226851851852 | 6.312 |
| 0.6918287037037038 | 6.312 |
| 0.6925462962962964 | 6.438 |
| 0.6929629629629629 | 6.125 |
| 0.6932754629629629 | 6.188 |
| 0.6939814814814814 | 6.312 |
| 0.694699074074074 | 6.375 |
| 0.6954050925925926 | 6.438 |
| 0.6957523148148148 | 6.688 |
| 0.6961342592592592 | 6.688 |
| 0.6968518518518518 | 6.625 |
| 0.6975578703703703 | 6.562 |
| 0.698275462962963 | 6.438 |
| 0.6989930555555556 | 6.438 |
| 0.6996990740740742 | 6.188 |
| 0.6997106481481481 | 6.125 |
| 0.7004282407407407 | 6.062 |
| 0.7011342592592592 | 6.125 |
| 0.7018518518518518 | 5.875 |
| 0.7025694444444445 | 6 |
| 0.7032754629629631 | 6.062 |
| 0.7039930555555555 | 5.875 |
| 0.7046990740740741 | 6 |
| 0.7054166666666667 | 6.188 |
| 0.7061342592592593 | 6.125 |
| 0.7068402777777778 | 6.062 |
| 0.7075578703703704 | 6 |
| 0.7082638888888889 | 5.938 |
| 0.7089814814814814 | 5.938 |
| 0.7096874999999999 | 6.062 |
| 0.7104050925925925 | 6.062 |
| 0.7111111111111111 | 6.125 |
| 0.7118287037037038 | 6 |
| 0.7125462962962964 | 6 |
| 0.7132523148148149 | 5.938 |
| 0.7139699074074074 | 6 |
| 0.7146759259259259 | 5.938 |
| 0.7153935185185185 | 5.875 |
| 0.7161111111111111 | 5.75 |
| 0.7168171296296296 | 5.812 |
| 0.7175347222222223 | 5.812 |
| 0.7182407407407408 | 5.75 |
| 0.7189583333333333 | 5.75 |
| 0.7196643518518518 | 5.75 |
| 0.7203819444444445 | 5.625 |
| 0.721087962962963 | 5.812 |
| 0.7218055555555556 | 5.75 |
| 0.7225231481481482 | 5.688 |
| 0.7232291666666667 | 5.688 |
| 0.7239467592592592 | 5.812 |
| 0.7246527777777777 | 5.75 |
| 0.7253703703703703 | 5.75 |
| 0.7260763888888889 | 5.812 |
| 0.7267939814814816 | 5.938 |
| 0.727511574074074 | 6.312 |
| 0.7281828703703703 | 6.688 |
| 0.7282291666666666 | 6.625 |
| 0.7289467592592592 | 6.875 |
| 0.7296643518518519 | 6.5 |
| 0.7303703703703704 | 6.5 |
| 0.7310879629629629 | 6.562 |
| 0.7317939814814814 | 6.312 |
| 0.7325115740740741 | 6.812 |
| 0.7332175925925926 | 6.812 |
| 0.7336689814814815 | 7.25 |
| 0.7339467592592593 | 7.25 |
| 0.7346643518518517 | 7 |
| 0.7353703703703703 | 7.312 |
| 0.736087962962963 | 7.312 |
| 0.7367939814814815 | 7.375 |
| 0.7375115740740741 | 7.25 |
| 0.7382175925925926 | 7.312 |
| 0.7389351851851852 | 7.562 |
| 0.7429976851851853 | 6.938 |
| 0.7437152777777777 | 6.875 |
| 0.7444328703703703 | 6.812 |
| 0.7449074074074074 | 6.688 |
| 0.745150462962963 | 6.625 |
| 0.7458680555555556 | 6.562 |
| 0.7465856481481481 | 6.312 |
| 0.7472916666666666 | 6.375 |
| 0.7478472222222222 | 6.125 |
| 0.7480208333333334 | 6.125 |
| 0.748738425925926 | 6.062 |
| 0.7494444444444445 | 6.062 |
| 0.750162037037037 | 5.875 |
| 0.7508680555555555 | 5.938 |
| 0.7515856481481481 | 5.875 |
| 0.7523032407407407 | 5.625 |
| 0.7524189814814815 | 5.562 |
| 0.7530208333333334 | 5.625 |
| 0.7537384259259259 | 5.5 |
| 0.7544560185185185 | 5.438 |
| 0.755162037037037 | 5.312 |
| 0.7558796296296296 | 5.25 |
| 0.7565856481481482 | 5.188 |
| 0.7573032407407408 | 5.125 |
| 0.7580092592592593 | 5.125 |
| 0.758599537037037 | 5 |
| 0.7587384259259259 | 5 |
| 0.7594560185185185 | 4.938 |
| 0.7601620370370371 | 4.875 |
| 0.7608796296296297 | 4.75 |
| 0.7615856481481482 | 4.688 |
| 0.7623032407407407 | 4.688 |
| 0.7630208333333334 | 4.562 |
| 0.7637268518518519 | 4.562 |
| 0.7644444444444445 | 4.562 |
| 0.765150462962963 | 4.562 |
| 0.7658680555555556 | 4.562 |
| 0.766574074074074 | 4.562 |
| 0.7672916666666666 | 4.625 |
| 0.7680092592592592 | 4.625 |
| 0.7687152777777778 | 4.562 |
| 0.7694328703703704 | 4.625 |
| 0.7701388888888889 | 4.562 |
| 0.7708564814814814 | 4.625 |
| 0.7715624999999999 | 4.625 |
| 0.7722800925925926 | 4.625 |
| 0.7729976851851852 | 4.625 |
| 0.7737037037037037 | 4.625 |
| 0.7744212962962963 | 4.562 |
| 0.7751273148148149 | 4.562 |
| 0.7758449074074073 | 4.625 |
| 0.7765624999999999 | 4.625 |
| 0.7772685185185185 | 4.625 |
| 0.7779861111111112 | 4.562 |
| 0.7786921296296296 | 4.562 |
| 0.7794097222222223 | 4.5 |
| 0.7795717592592593 | 4.438 |
| 0.7801388888888888 | 4.438 |
| 0.7808449074074074 | 4.312 |
| 0.7815625 | 4.375 |
| 0.7822685185185185 | 4.312 |
| 0.7829861111111112 | 4.25 |
| 0.7837037037037037 | 4.25 |
| 0.7844097222222222 | 4.188 |
| 0.7851273148148148 | 4.125 |
| 0.7858333333333333 | 4.125 |
| 0.7865509259259259 | 4.125 |
| 0.7872569444444445 | 4.125 |
| 0.7879745370370371 | 4.062 |
| 0.7886921296296295 | 4.062 |
| 0.7893981481481481 | 4 |
| 0.7901157407407408 | 4 |
| 0.7908217592592592 | 4 |
| 0.7915393518518519 | 3.938 |
| 0.7922453703703703 | 3.938 |
| 0.792962962962963 | 3.938 |
| 0.7936805555555555 | 3.938 |
| 0.7938425925925926 | 3.875 |
| 0.7943981481481481 | 3.812 |
| 0.7951157407407408 | 3.875 |
| 0.7958217592592592 | 3.812 |
| 0.7965393518518519 | 3.812 |
| 0.7972569444444444 | 3.75 |
| 0.7979629629629629 | 3.75 |
| 0.7986805555555555 | 3.688 |
| 0.7993865740740741 | 3.75 |
| 0.8001041666666667 | 3.688 |
| 0.8008217592592594 | 3.75 |
| 0.8015277777777778 | 3.625 |
| 0.8022453703703704 | 3.625 |
| 0.8029513888888888 | 3.625 |
| 0.8036689814814815 | 3.625 |
| 0.804375 | 3.562 |
| 0.8050925925925926 | 3.562 |
| 0.8058101851851852 | 3.5 |
| 0.8065162037037038 | 3.5 |
| 0.8072337962962962 | 3.438 |
| 0.8079398148148148 | 3.375 |
| 0.8082060185185185 | 3.312 |
| 0.8086689814814815 | 3.312 |
| 0.8093865740740741 | 3.25 |
| 0.8100925925925927 | 3.25 |
| 0.8108101851851851 | 3.188 |
| 0.8115162037037037 | 3.25 |
| 0.8122337962962963 | 3.188 |
| 0.812951388888889 | 3.188 |
| 0.8136574074074074 | 3.188 |
| 0.8143750000000001 | 3.125 |
| 0.8150810185185186 | 3.188 |
| 0.8157986111111111 | 3.125 |
| 0.8165162037037037 | 3.062 |
| 0.8172222222222222 | 3 |
| 0.8179398148148148 | 3.062 |
| 0.8186458333333334 | 3.062 |
| 0.819363425925926 | 3.062 |
| 0.8200810185185184 | 3 |
| 0.820787037037037 | 3 |
| 0.8215046296296297 | 3 |
| 0.8222106481481481 | 2.938 |
| 0.8229282407407408 | 2.938 |
| 0.8236458333333333 | 2.938 |
| 0.8243518518518519 | 2.938 |
| 0.8250694444444444 | 2.875 |
| 0.8257754629629629 | 2.875 |
| 0.8264930555555555 | 2.875 |
| 0.8272106481481482 | 2.875 |
| 0.8279166666666667 | 2.875 |
| 0.8286342592592592 | 2.875 |
| 0.8293402777777777 | 2.875 |
| 0.8300578703703704 | 2.812 |
| 0.830775462962963 | 2.812 |
| 0.8312962962962963 | 2.75 |
| 0.8314930555555556 | 2.75 |
| 0.832210648148148 | 2.75 |
| 0.8329282407407407 | 2.75 |
| 0.8336342592592593 | 2.75 |
| 0.8343518518518519 | 2.75 |
| 0.8350578703703704 | 2.688 |
| 0.835775462962963 | 2.688 |
| 0.8364930555555555 | 2.688 |
| 0.837199074074074 | 2.688 |
| 0.8379166666666666 | 2.625 |
| 0.8386226851851851 | 2.625 |
| 0.8393402777777778 | 2.625 |
| 0.8400578703703704 | 2.625 |
| 0.840763888888889 | 2.5 |
| 0.8414814814814814 | 2.5 |
| 0.8421875 | 2.438 |
| 0.8429050925925926 | 2.438 |
| 0.8436226851851852 | 2.375 |
| 0.8443287037037037 | 2.438 |
| 0.8450462962962964 | 2.438 |
| 0.8457523148148148 | 2.438 |
| 0.8464699074074074 | 2.375 |
| 0.8471875 | 2.312 |
| 0.8478935185185185 | 2.312 |
| 0.8486111111111111 | 2.25 |
| 0.8493171296296297 | 2.312 |
| 0.8500347222222223 | 2.25 |
| 0.8507523148148147 | 2.25 |
| 0.851400462962963 | 2.188 |
| 0.8514699074074074 | 2.188 |
| 0.8521875 | 2.188 |
| 0.8529050925925926 | 2.188 |
| 0.8536111111111112 | 2.125 |
| 0.8543287037037036 | 2.188 |
| 0.8550347222222222 | 2.125 |
| 0.8557523148148148 | 2.125 |
| 0.8564699074074075 | 2.125 |
| 0.857175925925926 | 2.125 |
| 0.8578935185185186 | 2.188 |
| 0.8585995370370371 | 2.125 |
| 0.8593171296296296 | 2.062 |
| 0.8600347222222222 | 2.062 |
| 0.8607407407407407 | 2.062 |
| 0.8614583333333333 | 2 |
| 0.8654513888888888 | 1.938 |
| 0.8661689814814815 | 1.875 |
| 0.8668865740740741 | 1.875 |
| 0.8675925925925926 | 1.875 |
| 0.8683101851851852 | 1.875 |
| 0.8690277777777777 | 1.812 |
| 0.8697337962962962 | 1.812 |
| 0.8704513888888888 | 1.812 |
| 0.8711574074074074 | 1.812 |
| 0.8718750000000001 | 1.812 |
| 0.8725925925925927 | 1.812 |
| 0.8732986111111112 | 1.75 |
| 0.8740162037037037 | 1.688 |
| 0.8747337962962963 | 1.688 |
| 0.8754398148148148 | 1.75 |
| 0.8761574074074074 | 1.688 |
| 0.8768634259259259 | 1.688 |
| 0.8769907407407408 | 1.625 |
| 0.8775925925925926 | 1.625 |
| 0.8783101851851852 | 1.562 |
| 0.8790162037037037 | 1.562 |
| 0.8797337962962963 | 1.562 |
| 0.8804513888888889 | 1.562 |
| 0.8811574074074073 | 1.5 |
| 0.881875 | 1.5 |
| 0.8825810185185184 | 1.5 |
| 0.8832986111111111 | 1.5 |
| 0.8840162037037037 | 1.5 |
| 0.8847222222222223 | 1.5 |
| 0.8854398148148147 | 1.438 |
| 0.8861458333333333 | 1.438 |
| 0.8868634259259259 | 1.375 |
| 0.8875810185185186 | 1.375 |
| 0.888287037037037 | 1.375 |
| 0.8890046296296297 | 1.438 |
| 0.8897106481481482 | 1.375 |
| 0.8904282407407407 | 1.375 |
| 0.8911458333333333 | 1.375 |
| 0.8918518518518518 | 1.375 |
| 0.8925694444444444 | 1.375 |
| 0.893275462962963 | 1.312 |
| 0.8939930555555556 | 1.312 |
| 0.894710648148148 | 1.312 |
| 0.8954166666666666 | 1.312 |
| 0.8961342592592593 | 1.312 |
| 0.8968402777777778 | 1.312 |
| 0.8975578703703704 | 1.25 |
| 0.898275462962963 | 1.188 |
| 0.8989814814814815 | 1.188 |
| 0.899699074074074 | 1.25 |
| 0.9004050925925925 | 1.188 |
| 0.9011226851851851 | 1.125 |
| 0.9018402777777778 | 1.125 |
| 0.9023032407407406 | 1.062 |
| 0.9025578703703704 | 1.125 |
| 0.9032754629629629 | 1.125 |
| 0.9039930555555555 | 1.125 |
| 0.904699074074074 | 1.062 |
| 0.9054166666666666 | 1.062 |
| 0.9061342592592593 | 1.062 |
| 0.9068402777777779 | 1.062 |
| 0.9075578703703703 | 1.062 |
| 0.9082638888888889 | 0.938 |
| 0.9089814814814815 | 1 |
| 0.9096990740740741 | 1 |
| 0.9104050925925926 | 1 |
| 0.9111226851851852 | 1 |
| 0.9118287037037037 | 1 |
| 0.9125462962962962 | 1 |
| 0.9132523148148147 | 1.062 |
| 0.9139699074074074 | 1 |
| 0.9146875 | 0.938 |
| 0.9153935185185186 | 0.938 |
| 0.9161111111111112 | 1.062 |
| 0.9168171296296297 | 1 |
| 0.9175347222222222 | 0.938 |
| 0.9182523148148148 | 0.938 |
| 0.9189583333333333 | 0.875 |
| 0.919675925925926 | 0.938 |
| 0.9203819444444444 | 0.875 |
| 0.9210995370370371 | 0.812 |
| 0.9218171296296296 | 0.812 |
| 0.9225231481481481 | 0.875 |
| 0.9232407407407407 | 0.875 |
| 0.9239467592592593 | 0.812 |
| 0.9246643518518519 | 0.812 |
| 0.9253819444444445 | 0.812 |
| 0.926087962962963 | 0.812 |
| 0.9268055555555555 | 0.812 |
| 0.927511574074074 | 0.812 |
| 0.9282291666666667 | 0.75 |
| 0.9289467592592593 | 0.75 |
| 0.9296527777777778 | 0.75 |
| 0.9303703703703704 | 0.75 |
| 0.931076388888889 | 0.75 |
| 0.9317939814814814 | 0.75 |
| 0.932511574074074 | 0.75 |
| 0.9332175925925926 | 0.75 |
| 0.9339351851851853 | 0.688 |
| 0.9346412037037037 | 0.688 |
| 0.9353587962962964 | 0.688 |
| 0.9360763888888889 | 0.688 |
| 0.9367824074074074 | 0.688 |
| 0.9375 | 0.688 |
| 0.9382060185185185 | 0.75 |
| 0.9389236111111111 | 0.688 |
| 0.9396412037037036 | 0.688 |
| 0.9403472222222223 | 0.688 |
| 0.9410648148148147 | 0.688 |
| 0.9417708333333333 | 0.75 |
| 0.942488425925926 | 0.688 |
| 0.9432060185185186 | 0.688 |
| 0.9439120370370371 | 0.688 |
| 0.9446296296296296 | 0.688 |
| 0.9453356481481481 | 0.688 |
| 0.9460532407407407 | 0.625 |
| 0.9467708333333333 | 0.625 |
| 0.9474768518518518 | 0.562 |
| 0.9478356481481481 | 0.5 |
| 0.9482060185185185 | 0.562 |
| 0.9489236111111111 | 0.562 |
| 0.9496296296296296 | 0.562 |
| 0.9503472222222222 | 0.562 |
| 0.9510648148148149 | 0.5 |
| 0.9517708333333333 | 0.562 |
| 0.9524884259259259 | 0.562 |
| 0.9531944444444443 | 0.625 |
| 0.953912037037037 | 0.562 |
| 0.9546296296296296 | 0.625 |
| 0.9553356481481482 | 0.625 |
| 0.9560532407407408 | 0.562 |
| 0.9567592592592593 | 0.625 |
| 0.9574768518518518 | 0.625 |
| 0.9581944444444445 | 0.625 |
| 0.9589004629629629 | 0.562 |
| 0.9596180555555556 | 0.562 |
| 0.9603356481481482 | 0.562 |
| 0.9610416666666667 | 0.5 |
| 0.9617592592592592 | 0.625 |
| 0.9624652777777777 | 0.562 |
| 0.9631828703703703 | 0.438 |
| 0.963900462962963 | 0.5 |
| 0.9646064814814815 | 0.5 |
| 0.9653240740740742 | 0.438 |
| 0.9660300925925926 | 0.5 |
| 0.9667476851851852 | 0.5 |
| 0.9674652777777778 | 0.5 |
| 0.9681712962962963 | 0.5 |
| 0.9688888888888889 | 0.562 |
| 0.9695949074074074 | 0.562 |
| 0.9703125 | 0.562 |
| 0.9710300925925925 | 0.562 |
| 0.971736111111111 | 0.562 |
| 0.9724537037037037 | 0.562 |
| 0.9731597222222222 | 0.562 |
| 0.9738773148148149 | 0.625 |
| 0.9745949074074075 | 0.625 |
| 0.975300925925926 | 0.688 |
| 0.9760185185185185 | 0.688 |
| 0.976724537037037 | 0.625 |
| 0.9774421296296296 | 0.688 |
| 0.9781597222222222 | 0.688 |
| 0.9788657407407407 | 0.688 |
| 0.9795833333333334 | 0.75 |
| 0.9803009259259259 | 0.75 |
| 0.9810069444444444 | 0.75 |
| 0.981724537037037 | 0.75 |
| 0.9824305555555556 | 0.812 |
| 0.9831481481481482 | 0.75 |
| 0.9838657407407408 | 0.812 |
| 0.9845717592592593 | 0.812 |
| 0.9852893518518518 | 0.812 |
| 0.9859953703703703 | 0.875 |
| 0.986712962962963 | 0.812 |
| 0.9874305555555556 | 0.812 |
| 0.9881365740740741 | 0.812 |
| 0.9888541666666667 | 0.75 |
| 0.9895601851851853 | 0.688 |
| 0.9902777777777777 | 0.688 |
| 0.9909953703703703 | 0.562 |
| 0.9917013888888889 | 0.562 |
| 0.9924189814814816 | 0.625 |
| 0.993125 | 0.625 |
| 0.9938425925925927 | 0.562 |
| 0.9945601851851852 | 0.5 |
| 0.9952662037037037 | 0.5 |
| 0.9959837962962963 | 0.5 |
| 0.9966898148148148 | 0.438 |
| 0.9974074074074074 | 0.438 |
| 0.9981249999999999 | 0.438 |
| 0.9988310185185186 | 0.375 |
| 0.999548611111111 | 0.375 |